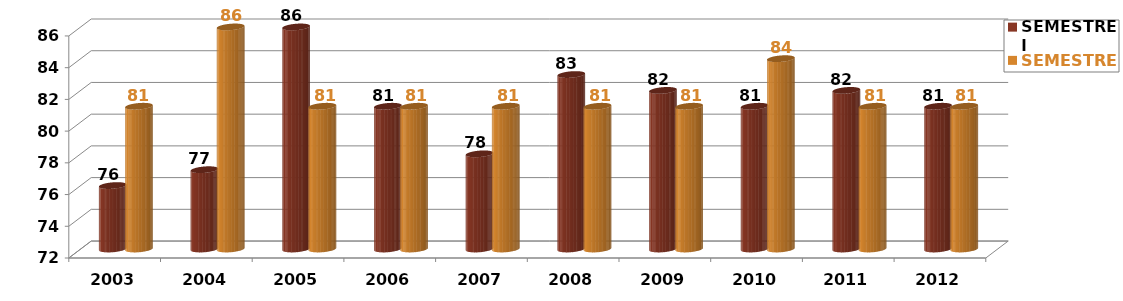
| Category | SEMESTRE I | SEMESTRE II |
|---|---|---|
| 2003.0 | 76 | 81 |
| 2004.0 | 77 | 86 |
| 2005.0 | 86 | 81 |
| 2006.0 | 81 | 81 |
| 2007.0 | 78 | 81 |
| 2008.0 | 83 | 81 |
| 2009.0 | 82 | 81 |
| 2010.0 | 81 | 84 |
| 2011.0 | 82 | 81 |
| 2012.0 | 81 | 81 |